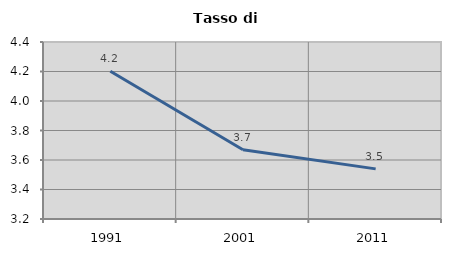
| Category | Tasso di disoccupazione   |
|---|---|
| 1991.0 | 4.202 |
| 2001.0 | 3.67 |
| 2011.0 | 3.54 |